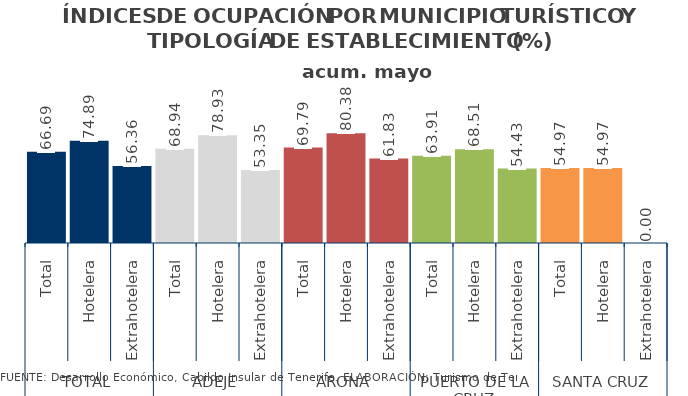
| Category | acum. mayo 2014 |
|---|---|
| 0 | 66.691 |
| 1 | 74.889 |
| 2 | 56.358 |
| 3 | 68.94 |
| 4 | 78.929 |
| 5 | 53.348 |
| 6 | 69.787 |
| 7 | 80.377 |
| 8 | 61.828 |
| 9 | 63.914 |
| 10 | 68.507 |
| 11 | 54.433 |
| 12 | 54.968 |
| 13 | 54.968 |
| 14 | 0 |